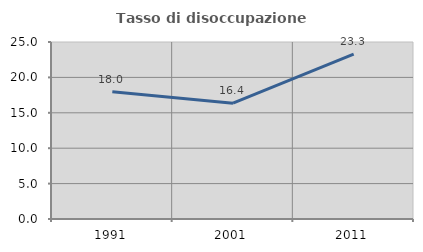
| Category | Tasso di disoccupazione giovanile  |
|---|---|
| 1991.0 | 17.98 |
| 2001.0 | 16.364 |
| 2011.0 | 23.293 |